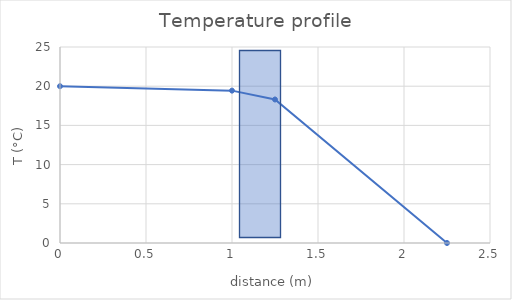
| Category | Series 0 |
|---|---|
| 0.0 | 20 |
| 1.0 | 19.435 |
| 1.25 | 18.305 |
| 2.25 | 0 |